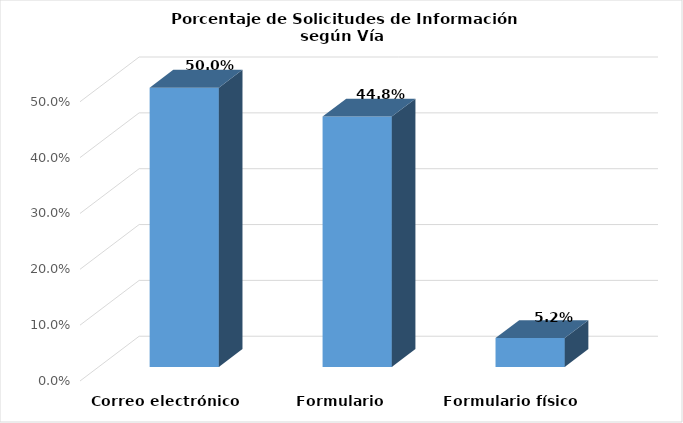
| Category | Series 0 |
|---|---|
| Correo electrónico | 0.5 |
| Formulario electrónico SAIP | 0.448 |
| Formulario físico | 0.052 |